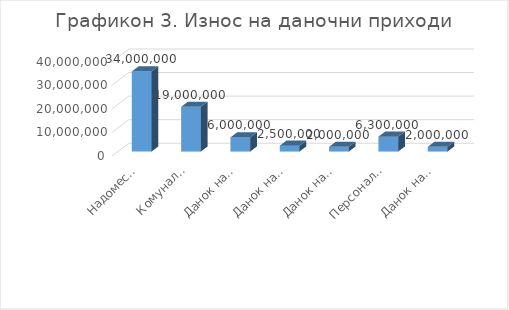
| Category | Износ |
|---|---|
| Надоместок за уредување на градежно земјиште | 34000000 |
| Комунална такса за користење и одржување на јавно осветление | 19000000 |
| Данок на промет на недвижности | 6000000 |
| Данок на имот од физички лица | 2500000 |
| Данок на имот од правни лица | 2000000 |
| Персонален данок на доход | 6300000 |
| Данок на наследство и подарок | 2000000 |